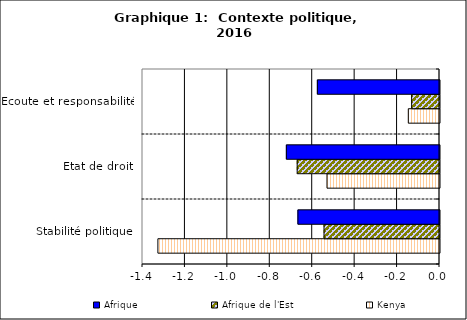
| Category | Kenya | Afrique de l'Est | Afrique |
|---|---|---|---|
| Stabilité politique | -1.327 | -0.544 | -0.667 |
| Etat de droit | -0.53 | -0.671 | -0.722 |
| Ecoute et responsabilité | -0.147 | -0.131 | -0.576 |